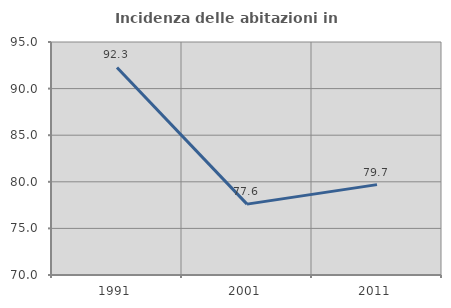
| Category | Incidenza delle abitazioni in proprietà  |
|---|---|
| 1991.0 | 92.265 |
| 2001.0 | 77.606 |
| 2011.0 | 79.698 |